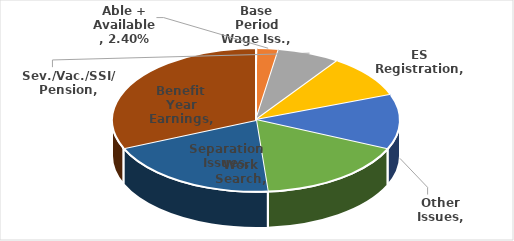
| Category | Series 0 |
|---|---|
| Base Period Wage Iss. | 0.001 |
| Able + Available | 0.024 |
| Sev./Vac./SSI/ Pension | 0.07 |
| ES Registration | 0.097 |
| Other Issues | 0.124 |
| Work Search | 0.17 |
| Separation Issues | 0.198 |
| Benefit Year Earnings | 0.315 |